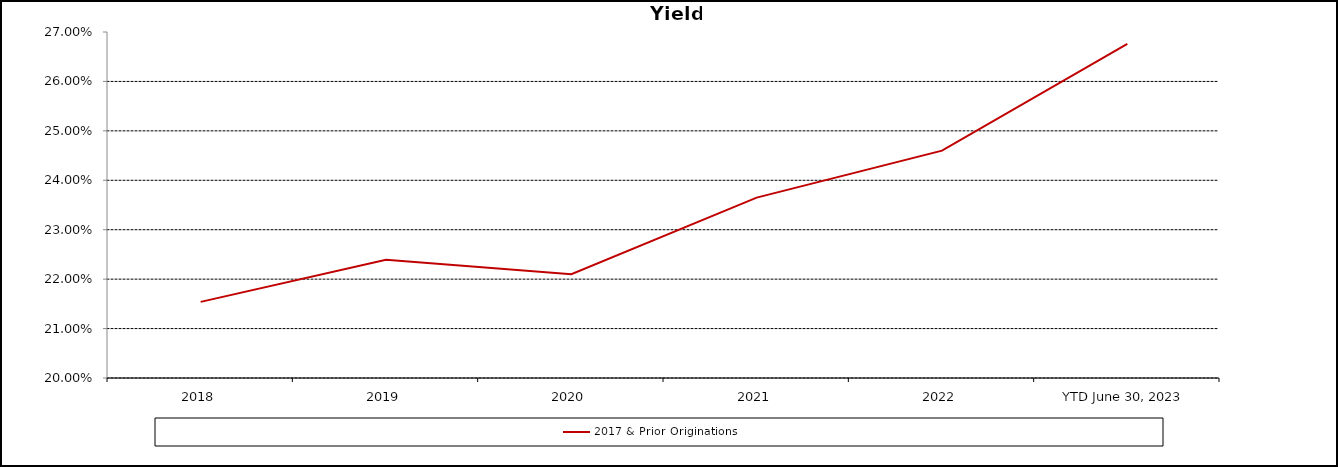
| Category | 2017 & Prior Originations |
|---|---|
| 2018 | 0.215 |
| 2019 | 0.224 |
| 2020 | 0.221 |
| 2021 | 0.236 |
| 2022 | 0.246 |
| YTD June 30, 2023 | 0.268 |